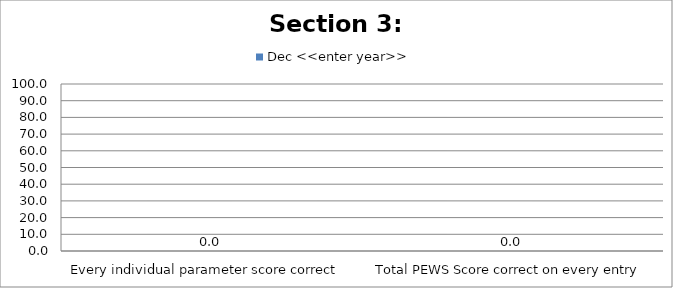
| Category | Dec <<enter year>> |
|---|---|
| Every individual parameter score correct  | 0 |
| Total PEWS Score correct on every entry | 0 |